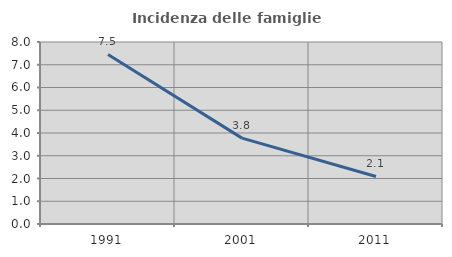
| Category | Incidenza delle famiglie numerose |
|---|---|
| 1991.0 | 7.451 |
| 2001.0 | 3.775 |
| 2011.0 | 2.09 |